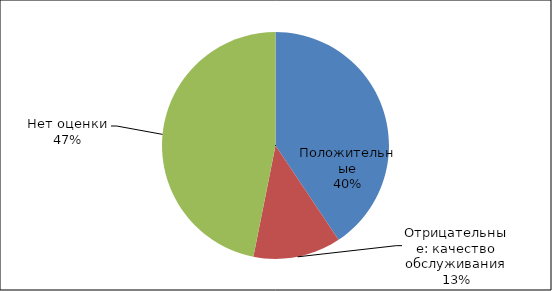
| Category | Series 0 | Series 1 |
|---|---|---|
| Положительные | 13 | 32 |
| Отрицательные: качество обслуживания | 4 | 32 |
| Нет оценки | 15 | 32 |